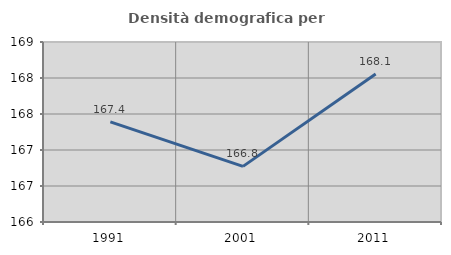
| Category | Densità demografica |
|---|---|
| 1991.0 | 167.39 |
| 2001.0 | 166.773 |
| 2011.0 | 168.054 |